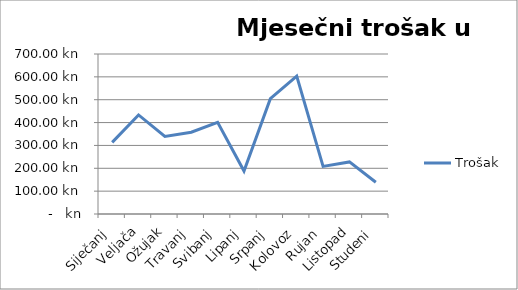
| Category | Trošak |
|---|---|
| Siječanj | 313.28 |
| Veljača | 433.43 |
| Ožujak | 339.09 |
| Travanj | 357.78 |
| Svibanj | 401.39 |
| Lipanj | 187.79 |
| Srpanj | 504.63 |
| Kolovoz | 603.42 |
| Rujan | 208.26 |
| Listopad | 227.84 |
| Studeni | 138.84 |